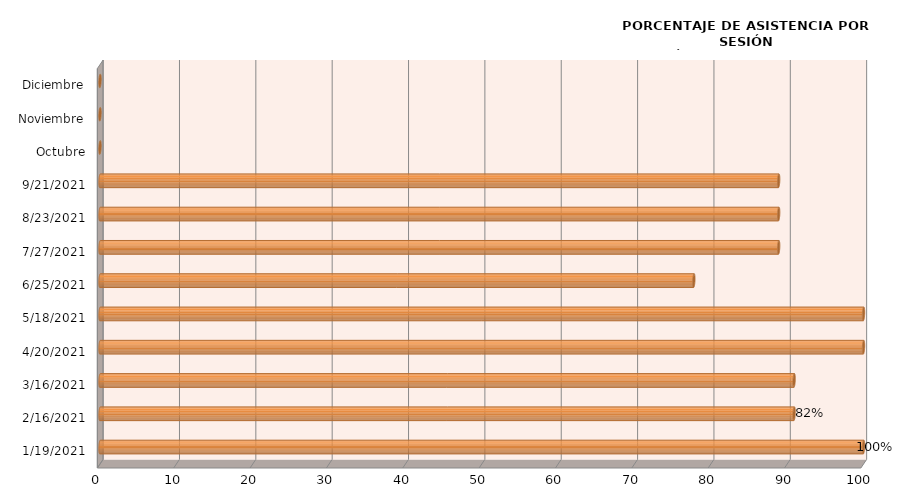
| Category | Series 0 |
|---|---|
| 19/01/2021 | 100 |
| 16/02/2021 | 90.909 |
| 16/03/2021 | 90.909 |
| 20/04/2021 | 100 |
| 18/05/2021 | 100 |
| 25/06/2021 | 77.778 |
| 27/07/2021 | 88.889 |
| 23/08/2021 | 88.889 |
| 21/09/2021 | 88.889 |
| Octubre | 0 |
| Noviembre | 0 |
| Diciembre | 0 |